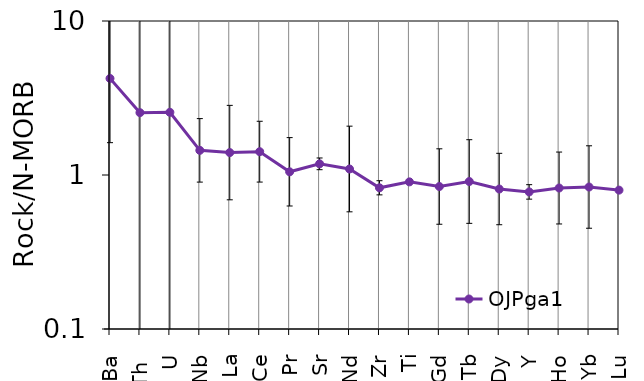
| Category | OJPga1  |
|---|---|
| Ba | 4.236 |
| Th  | 2.54 |
| U | 2.554 |
| Nb | 1.446 |
| La | 1.398 |
| Ce | 1.417 |
| Pr | 1.049 |
| Sr | 1.182 |
| Nd | 1.094 |
| Zr | 0.826 |
| Ti | 0.902 |
| Gd | 0.842 |
| Tb | 0.907 |
| Dy | 0.811 |
| Y | 0.777 |
| Ho | 0.823 |
| Yb | 0.836 |
| Lu | 0.797 |